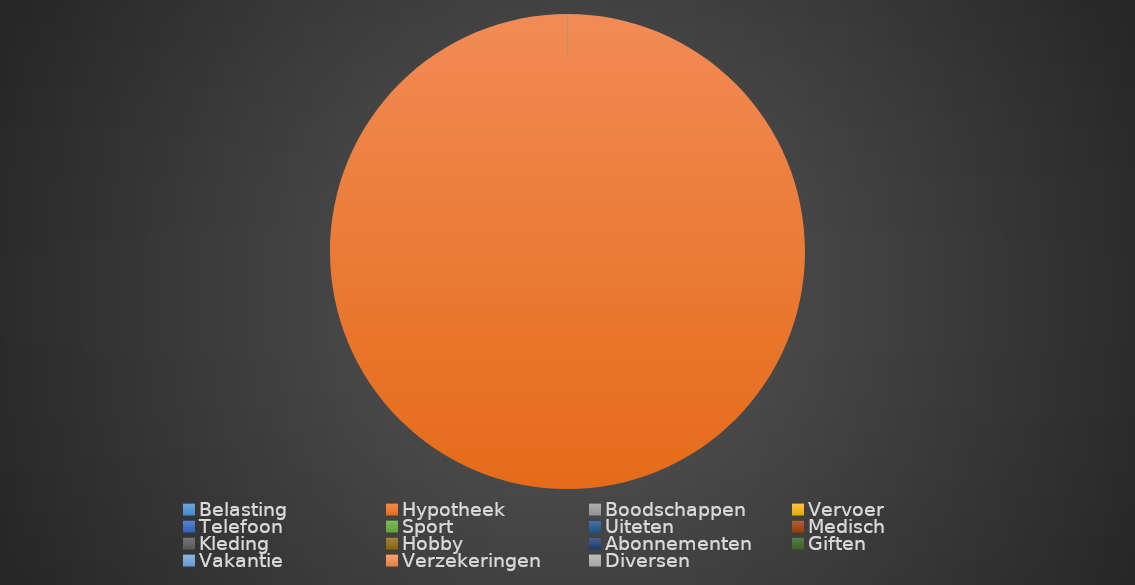
| Category | Series 0 |
|---|---|
| Belasting | 0 |
| Hypotheek | 1 |
| Boodschappen | 0 |
| Vervoer | 0 |
| Telefoon | 0 |
| Sport | 0 |
| Uiteten | 0 |
| Medisch | 0 |
| Kleding | 0 |
| Hobby | 0 |
| Abonnementen | 0 |
| Giften | 0 |
| Vakantie | 0 |
| Verzekeringen | 0 |
| Diversen | 0 |